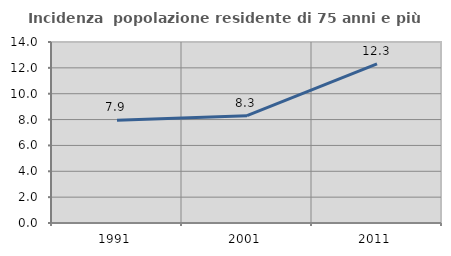
| Category | Incidenza  popolazione residente di 75 anni e più |
|---|---|
| 1991.0 | 7.94 |
| 2001.0 | 8.301 |
| 2011.0 | 12.308 |